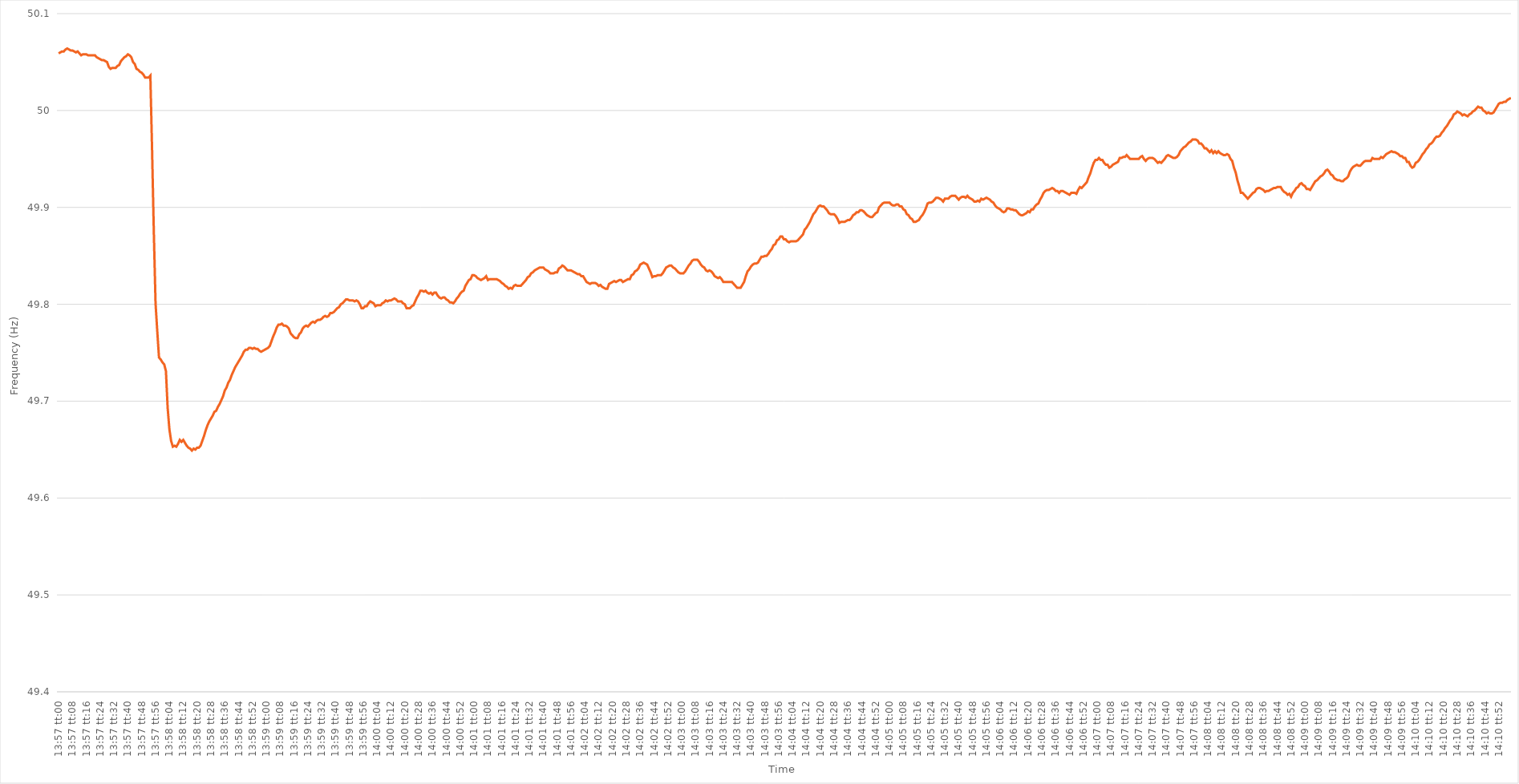
| Category | Series 0 |
|---|---|
| 0.5812499999999999 | 50.059 |
| 0.5812615740740741 | 50.06 |
| 0.5812731481481481 | 50.061 |
| 0.5812847222222223 | 50.061 |
| 0.5812962962962963 | 50.063 |
| 0.5813078703703703 | 50.064 |
| 0.5813194444444444 | 50.063 |
| 0.5813310185185185 | 50.062 |
| 0.5813425925925926 | 50.062 |
| 0.5813541666666667 | 50.061 |
| 0.5813657407407408 | 50.06 |
| 0.5813773148148148 | 50.061 |
| 0.5813888888888888 | 50.059 |
| 0.581400462962963 | 50.057 |
| 0.581412037037037 | 50.058 |
| 0.5814236111111112 | 50.058 |
| 0.5814351851851852 | 50.058 |
| 0.5814467592592593 | 50.057 |
| 0.5814583333333333 | 50.057 |
| 0.5814699074074073 | 50.057 |
| 0.5814814814814815 | 50.057 |
| 0.5814930555555555 | 50.057 |
| 0.5815046296296297 | 50.055 |
| 0.5815162037037037 | 50.054 |
| 0.5815277777777778 | 50.053 |
| 0.5815393518518518 | 50.052 |
| 0.5815509259259259 | 50.052 |
| 0.5815625 | 50.051 |
| 0.5815740740740741 | 50.05 |
| 0.5815856481481482 | 50.045 |
| 0.5815972222222222 | 50.043 |
| 0.5816087962962962 | 50.044 |
| 0.5816203703703704 | 50.044 |
| 0.5816319444444444 | 50.044 |
| 0.5816435185185186 | 50.046 |
| 0.5816550925925926 | 50.047 |
| 0.5816666666666667 | 50.051 |
| 0.5816782407407407 | 50.053 |
| 0.5816898148148147 | 50.055 |
| 0.5817013888888889 | 50.056 |
| 0.5817129629629629 | 50.058 |
| 0.5817245370370371 | 50.057 |
| 0.5817361111111111 | 50.055 |
| 0.5817476851851852 | 50.05 |
| 0.5817592592592592 | 50.048 |
| 0.5817708333333333 | 50.043 |
| 0.5817824074074074 | 50.042 |
| 0.5817939814814815 | 50.04 |
| 0.5818055555555556 | 50.039 |
| 0.5818171296296296 | 50.037 |
| 0.5818287037037037 | 50.034 |
| 0.5818402777777778 | 50.034 |
| 0.5818518518518518 | 50.034 |
| 0.581863425925926 | 50.036 |
| 0.581875 | 49.959 |
| 0.5818865740740741 | 49.875 |
| 0.5818981481481481 | 49.801 |
| 0.5819097222222223 | 49.772 |
| 0.5819212962962963 | 49.745 |
| 0.5819328703703703 | 49.743 |
| 0.5819444444444445 | 49.74 |
| 0.5819560185185185 | 49.738 |
| 0.5819675925925926 | 49.731 |
| 0.5819791666666666 | 49.693 |
| 0.5819907407407408 | 49.671 |
| 0.5820023148148148 | 49.659 |
| 0.5820138888888889 | 49.653 |
| 0.582025462962963 | 49.654 |
| 0.582037037037037 | 49.653 |
| 0.5820486111111111 | 49.656 |
| 0.5820601851851852 | 49.66 |
| 0.5820717592592592 | 49.658 |
| 0.5820833333333334 | 49.66 |
| 0.5820949074074074 | 49.657 |
| 0.5821064814814815 | 49.654 |
| 0.5821180555555555 | 49.652 |
| 0.5821296296296297 | 49.651 |
| 0.5821412037037037 | 49.649 |
| 0.5821527777777777 | 49.651 |
| 0.5821643518518519 | 49.65 |
| 0.5821759259259259 | 49.652 |
| 0.5821875 | 49.652 |
| 0.582199074074074 | 49.654 |
| 0.5822106481481482 | 49.659 |
| 0.5822222222222222 | 49.664 |
| 0.5822337962962963 | 49.67 |
| 0.5822453703703704 | 49.675 |
| 0.5822569444444444 | 49.679 |
| 0.5822685185185185 | 49.682 |
| 0.5822800925925926 | 49.685 |
| 0.5822916666666667 | 49.689 |
| 0.5823032407407408 | 49.69 |
| 0.5823148148148148 | 49.694 |
| 0.5823263888888889 | 49.697 |
| 0.5823379629629629 | 49.701 |
| 0.5823495370370371 | 49.705 |
| 0.5823611111111111 | 49.711 |
| 0.5823726851851853 | 49.714 |
| 0.5823842592592593 | 49.719 |
| 0.5823958333333333 | 49.722 |
| 0.5824074074074074 | 49.727 |
| 0.5824189814814814 | 49.731 |
| 0.5824305555555556 | 49.735 |
| 0.5824421296296296 | 49.738 |
| 0.5824537037037038 | 49.741 |
| 0.5824652777777778 | 49.744 |
| 0.5824768518518518 | 49.747 |
| 0.5824884259259259 | 49.751 |
| 0.5825 | 49.753 |
| 0.5825115740740741 | 49.753 |
| 0.5825231481481482 | 49.755 |
| 0.5825347222222222 | 49.755 |
| 0.5825462962962963 | 49.754 |
| 0.5825578703703703 | 49.755 |
| 0.5825694444444445 | 49.754 |
| 0.5825810185185185 | 49.754 |
| 0.5825925925925927 | 49.752 |
| 0.5826041666666667 | 49.751 |
| 0.5826157407407407 | 49.752 |
| 0.5826273148148148 | 49.753 |
| 0.5826388888888888 | 49.754 |
| 0.582650462962963 | 49.755 |
| 0.582662037037037 | 49.757 |
| 0.5826736111111112 | 49.762 |
| 0.5826851851851852 | 49.767 |
| 0.5826967592592592 | 49.771 |
| 0.5827083333333333 | 49.776 |
| 0.5827199074074074 | 49.779 |
| 0.5827314814814815 | 49.779 |
| 0.5827430555555556 | 49.78 |
| 0.5827546296296297 | 49.778 |
| 0.5827662037037037 | 49.778 |
| 0.5827777777777777 | 49.777 |
| 0.5827893518518519 | 49.775 |
| 0.5828009259259259 | 49.77 |
| 0.5828125000000001 | 49.768 |
| 0.5828240740740741 | 49.766 |
| 0.5828356481481481 | 49.765 |
| 0.5828472222222222 | 49.765 |
| 0.5828587962962963 | 49.769 |
| 0.5828703703703704 | 49.771 |
| 0.5828819444444444 | 49.775 |
| 0.5828935185185186 | 49.777 |
| 0.5829050925925926 | 49.778 |
| 0.5829166666666666 | 49.777 |
| 0.5829282407407407 | 49.779 |
| 0.5829398148148148 | 49.781 |
| 0.5829513888888889 | 49.782 |
| 0.582962962962963 | 49.781 |
| 0.582974537037037 | 49.783 |
| 0.5829861111111111 | 49.784 |
| 0.5829976851851851 | 49.784 |
| 0.5830092592592593 | 49.785 |
| 0.5830208333333333 | 49.787 |
| 0.5830324074074075 | 49.788 |
| 0.5830439814814815 | 49.787 |
| 0.5830555555555555 | 49.788 |
| 0.5830671296296296 | 49.791 |
| 0.5830787037037037 | 49.791 |
| 0.5830902777777778 | 49.792 |
| 0.5831018518518518 | 49.794 |
| 0.583113425925926 | 49.796 |
| 0.583125 | 49.797 |
| 0.583136574074074 | 49.8 |
| 0.5831481481481481 | 49.801 |
| 0.5831597222222222 | 49.803 |
| 0.5831712962962963 | 49.805 |
| 0.5831828703703704 | 49.805 |
| 0.5831944444444445 | 49.804 |
| 0.5832060185185185 | 49.804 |
| 0.5832175925925925 | 49.804 |
| 0.5832291666666667 | 49.803 |
| 0.5832407407407407 | 49.804 |
| 0.5832523148148149 | 49.803 |
| 0.5832638888888889 | 49.8 |
| 0.583275462962963 | 49.796 |
| 0.583287037037037 | 49.796 |
| 0.5832986111111111 | 49.798 |
| 0.5833101851851852 | 49.798 |
| 0.5833217592592593 | 49.801 |
| 0.5833333333333334 | 49.803 |
| 0.5833449074074074 | 49.802 |
| 0.5833564814814814 | 49.801 |
| 0.5833680555555555 | 49.798 |
| 0.5833796296296296 | 49.799 |
| 0.5833912037037037 | 49.799 |
| 0.5834027777777778 | 49.799 |
| 0.5834143518518519 | 49.801 |
| 0.5834259259259259 | 49.802 |
| 0.5834374999999999 | 49.804 |
| 0.5834490740740741 | 49.803 |
| 0.5834606481481481 | 49.804 |
| 0.5834722222222223 | 49.804 |
| 0.5834837962962963 | 49.805 |
| 0.5834953703703704 | 49.806 |
| 0.5835069444444444 | 49.805 |
| 0.5835185185185185 | 49.803 |
| 0.5835300925925926 | 49.803 |
| 0.5835416666666667 | 49.803 |
| 0.5835532407407408 | 49.801 |
| 0.5835648148148148 | 49.8 |
| 0.5835763888888889 | 49.796 |
| 0.5835879629629629 | 49.796 |
| 0.583599537037037 | 49.796 |
| 0.5836111111111111 | 49.798 |
| 0.5836226851851852 | 49.799 |
| 0.5836342592592593 | 49.803 |
| 0.5836458333333333 | 49.807 |
| 0.5836574074074073 | 49.81 |
| 0.5836689814814815 | 49.814 |
| 0.5836805555555555 | 49.814 |
| 0.5836921296296297 | 49.813 |
| 0.5837037037037037 | 49.814 |
| 0.5837152777777778 | 49.812 |
| 0.5837268518518518 | 49.811 |
| 0.583738425925926 | 49.812 |
| 0.58375 | 49.81 |
| 0.5837615740740741 | 49.812 |
| 0.5837731481481482 | 49.812 |
| 0.5837847222222222 | 49.809 |
| 0.5837962962962963 | 49.807 |
| 0.5838078703703703 | 49.806 |
| 0.5838194444444444 | 49.807 |
| 0.5838310185185185 | 49.807 |
| 0.5838425925925926 | 49.805 |
| 0.5838541666666667 | 49.804 |
| 0.5838657407407407 | 49.802 |
| 0.5838773148148148 | 49.802 |
| 0.5838888888888889 | 49.801 |
| 0.5839004629629629 | 49.803 |
| 0.5839120370370371 | 49.806 |
| 0.5839236111111111 | 49.808 |
| 0.5839351851851852 | 49.811 |
| 0.5839467592592592 | 49.813 |
| 0.5839583333333334 | 49.814 |
| 0.5839699074074074 | 49.819 |
| 0.5839814814814815 | 49.822 |
| 0.5839930555555556 | 49.825 |
| 0.5840046296296296 | 49.826 |
| 0.5840162037037037 | 49.83 |
| 0.5840277777777778 | 49.83 |
| 0.5840393518518519 | 49.829 |
| 0.5840509259259259 | 49.827 |
| 0.5840625 | 49.826 |
| 0.5840740740740741 | 49.825 |
| 0.5840856481481481 | 49.826 |
| 0.5840972222222222 | 49.827 |
| 0.5841087962962963 | 49.829 |
| 0.5841203703703703 | 49.825 |
| 0.5841319444444445 | 49.826 |
| 0.5841435185185185 | 49.826 |
| 0.5841550925925926 | 49.826 |
| 0.5841666666666666 | 49.826 |
| 0.5841782407407408 | 49.826 |
| 0.5841898148148148 | 49.825 |
| 0.584201388888889 | 49.824 |
| 0.584212962962963 | 49.822 |
| 0.584224537037037 | 49.821 |
| 0.5842361111111111 | 49.819 |
| 0.5842476851851852 | 49.818 |
| 0.5842592592592593 | 49.816 |
| 0.5842708333333334 | 49.817 |
| 0.5842824074074074 | 49.816 |
| 0.5842939814814815 | 49.819 |
| 0.5843055555555555 | 49.82 |
| 0.5843171296296296 | 49.819 |
| 0.5843287037037037 | 49.819 |
| 0.5843402777777778 | 49.819 |
| 0.5843518518518519 | 49.821 |
| 0.5843634259259259 | 49.823 |
| 0.584375 | 49.825 |
| 0.584386574074074 | 49.828 |
| 0.5843981481481482 | 49.829 |
| 0.5844097222222222 | 49.832 |
| 0.5844212962962964 | 49.833 |
| 0.5844328703703704 | 49.835 |
| 0.5844444444444444 | 49.836 |
| 0.5844560185185185 | 49.837 |
| 0.5844675925925926 | 49.838 |
| 0.5844791666666667 | 49.838 |
| 0.5844907407407408 | 49.838 |
| 0.5845023148148148 | 49.836 |
| 0.5845138888888889 | 49.835 |
| 0.5845254629629629 | 49.834 |
| 0.584537037037037 | 49.832 |
| 0.5845486111111111 | 49.832 |
| 0.5845601851851852 | 49.832 |
| 0.5845717592592593 | 49.833 |
| 0.5845833333333333 | 49.833 |
| 0.5845949074074074 | 49.837 |
| 0.5846064814814814 | 49.838 |
| 0.5846180555555556 | 49.84 |
| 0.5846296296296296 | 49.839 |
| 0.5846412037037038 | 49.837 |
| 0.5846527777777778 | 49.835 |
| 0.5846643518518518 | 49.835 |
| 0.5846759259259259 | 49.835 |
| 0.5846875 | 49.834 |
| 0.5846990740740741 | 49.833 |
| 0.5847106481481482 | 49.832 |
| 0.5847222222222223 | 49.831 |
| 0.5847337962962963 | 49.831 |
| 0.5847453703703703 | 49.829 |
| 0.5847569444444444 | 49.829 |
| 0.5847685185185185 | 49.826 |
| 0.5847800925925926 | 49.823 |
| 0.5847916666666667 | 49.822 |
| 0.5848032407407407 | 49.821 |
| 0.5848148148148148 | 49.822 |
| 0.5848263888888888 | 49.822 |
| 0.584837962962963 | 49.822 |
| 0.584849537037037 | 49.821 |
| 0.5848611111111112 | 49.819 |
| 0.5848726851851852 | 49.82 |
| 0.5848842592592592 | 49.818 |
| 0.5848958333333333 | 49.817 |
| 0.5849074074074074 | 49.816 |
| 0.5849189814814815 | 49.816 |
| 0.5849305555555556 | 49.821 |
| 0.5849421296296297 | 49.822 |
| 0.5849537037037037 | 49.823 |
| 0.5849652777777777 | 49.824 |
| 0.5849768518518519 | 49.823 |
| 0.5849884259259259 | 49.824 |
| 0.585 | 49.825 |
| 0.5850115740740741 | 49.825 |
| 0.5850231481481482 | 49.823 |
| 0.5850347222222222 | 49.824 |
| 0.5850462962962962 | 49.825 |
| 0.5850578703703704 | 49.826 |
| 0.5850694444444444 | 49.826 |
| 0.5850810185185186 | 49.83 |
| 0.5850925925925926 | 49.831 |
| 0.5851041666666666 | 49.834 |
| 0.5851157407407407 | 49.835 |
| 0.5851273148148148 | 49.837 |
| 0.5851388888888889 | 49.841 |
| 0.585150462962963 | 49.842 |
| 0.5851620370370371 | 49.843 |
| 0.5851736111111111 | 49.842 |
| 0.5851851851851851 | 49.841 |
| 0.5851967592592593 | 49.837 |
| 0.5852083333333333 | 49.833 |
| 0.5852199074074075 | 49.828 |
| 0.5852314814814815 | 49.829 |
| 0.5852430555555556 | 49.829 |
| 0.5852546296296296 | 49.83 |
| 0.5852662037037036 | 49.83 |
| 0.5852777777777778 | 49.83 |
| 0.5852893518518518 | 49.832 |
| 0.585300925925926 | 49.835 |
| 0.5853125 | 49.838 |
| 0.585324074074074 | 49.839 |
| 0.5853356481481481 | 49.84 |
| 0.5853472222222222 | 49.84 |
| 0.5853587962962963 | 49.838 |
| 0.5853703703703704 | 49.837 |
| 0.5853819444444445 | 49.835 |
| 0.5853935185185185 | 49.833 |
| 0.5854050925925925 | 49.832 |
| 0.5854166666666667 | 49.832 |
| 0.5854282407407407 | 49.832 |
| 0.5854398148148149 | 49.834 |
| 0.5854513888888889 | 49.837 |
| 0.585462962962963 | 49.84 |
| 0.585474537037037 | 49.842 |
| 0.585486111111111 | 49.845 |
| 0.5854976851851852 | 49.846 |
| 0.5855092592592592 | 49.846 |
| 0.5855208333333334 | 49.846 |
| 0.5855324074074074 | 49.844 |
| 0.5855439814814815 | 49.841 |
| 0.5855555555555555 | 49.839 |
| 0.5855671296296296 | 49.838 |
| 0.5855787037037037 | 49.835 |
| 0.5855902777777778 | 49.834 |
| 0.5856018518518519 | 49.835 |
| 0.5856134259259259 | 49.834 |
| 0.585625 | 49.832 |
| 0.5856365740740741 | 49.829 |
| 0.5856481481481481 | 49.828 |
| 0.5856597222222223 | 49.827 |
| 0.5856712962962963 | 49.828 |
| 0.5856828703703704 | 49.826 |
| 0.5856944444444444 | 49.823 |
| 0.5857060185185184 | 49.823 |
| 0.5857175925925926 | 49.823 |
| 0.5857291666666666 | 49.823 |
| 0.5857407407407408 | 49.823 |
| 0.5857523148148148 | 49.823 |
| 0.5857638888888889 | 49.821 |
| 0.5857754629629629 | 49.819 |
| 0.585787037037037 | 49.817 |
| 0.5857986111111111 | 49.817 |
| 0.5858101851851852 | 49.817 |
| 0.5858217592592593 | 49.82 |
| 0.5858333333333333 | 49.823 |
| 0.5858449074074074 | 49.829 |
| 0.5858564814814815 | 49.834 |
| 0.5858680555555555 | 49.836 |
| 0.5858796296296297 | 49.839 |
| 0.5858912037037037 | 49.841 |
| 0.5859027777777778 | 49.842 |
| 0.5859143518518518 | 49.842 |
| 0.585925925925926 | 49.843 |
| 0.5859375 | 49.846 |
| 0.585949074074074 | 49.849 |
| 0.5859606481481482 | 49.849 |
| 0.5859722222222222 | 49.85 |
| 0.5859837962962963 | 49.85 |
| 0.5859953703703703 | 49.852 |
| 0.5860069444444445 | 49.855 |
| 0.5860185185185185 | 49.857 |
| 0.5860300925925926 | 49.861 |
| 0.5860416666666667 | 49.862 |
| 0.5860532407407407 | 49.866 |
| 0.5860648148148148 | 49.867 |
| 0.5860763888888889 | 49.87 |
| 0.586087962962963 | 49.87 |
| 0.5860995370370371 | 49.867 |
| 0.5861111111111111 | 49.867 |
| 0.5861226851851852 | 49.865 |
| 0.5861342592592592 | 49.864 |
| 0.5861458333333334 | 49.865 |
| 0.5861574074074074 | 49.865 |
| 0.5861689814814816 | 49.865 |
| 0.5861805555555556 | 49.865 |
| 0.5861921296296296 | 49.866 |
| 0.5862037037037037 | 49.868 |
| 0.5862152777777777 | 49.87 |
| 0.5862268518518519 | 49.872 |
| 0.5862384259259259 | 49.877 |
| 0.58625 | 49.879 |
| 0.5862615740740741 | 49.882 |
| 0.5862731481481481 | 49.885 |
| 0.5862847222222222 | 49.889 |
| 0.5862962962962963 | 49.893 |
| 0.5863078703703704 | 49.895 |
| 0.5863194444444445 | 49.898 |
| 0.5863310185185185 | 49.901 |
| 0.5863425925925926 | 49.902 |
| 0.5863541666666666 | 49.901 |
| 0.5863657407407408 | 49.901 |
| 0.5863773148148148 | 49.899 |
| 0.586388888888889 | 49.897 |
| 0.586400462962963 | 49.894 |
| 0.586412037037037 | 49.893 |
| 0.5864236111111111 | 49.893 |
| 0.5864351851851851 | 49.893 |
| 0.5864467592592593 | 49.891 |
| 0.5864583333333333 | 49.888 |
| 0.5864699074074075 | 49.884 |
| 0.5864814814814815 | 49.885 |
| 0.5864930555555555 | 49.885 |
| 0.5865046296296296 | 49.885 |
| 0.5865162037037037 | 49.886 |
| 0.5865277777777778 | 49.887 |
| 0.5865393518518519 | 49.887 |
| 0.586550925925926 | 49.889 |
| 0.5865625 | 49.892 |
| 0.586574074074074 | 49.893 |
| 0.5865856481481482 | 49.895 |
| 0.5865972222222222 | 49.895 |
| 0.5866087962962964 | 49.897 |
| 0.5866203703703704 | 49.897 |
| 0.5866319444444444 | 49.896 |
| 0.5866435185185185 | 49.894 |
| 0.5866550925925925 | 49.892 |
| 0.5866666666666667 | 49.891 |
| 0.5866782407407407 | 49.89 |
| 0.5866898148148149 | 49.89 |
| 0.5867013888888889 | 49.892 |
| 0.5867129629629629 | 49.894 |
| 0.586724537037037 | 49.895 |
| 0.5867361111111111 | 49.9 |
| 0.5867476851851852 | 49.902 |
| 0.5867592592592593 | 49.904 |
| 0.5867708333333334 | 49.905 |
| 0.5867824074074074 | 49.905 |
| 0.5867939814814814 | 49.905 |
| 0.5868055555555556 | 49.905 |
| 0.5868171296296296 | 49.903 |
| 0.5868287037037038 | 49.902 |
| 0.5868402777777778 | 49.902 |
| 0.5868518518518518 | 49.903 |
| 0.5868634259259259 | 49.903 |
| 0.586875 | 49.901 |
| 0.5868865740740741 | 49.901 |
| 0.5868981481481481 | 49.898 |
| 0.5869097222222223 | 49.897 |
| 0.5869212962962963 | 49.893 |
| 0.5869328703703703 | 49.892 |
| 0.5869444444444444 | 49.889 |
| 0.5869560185185185 | 49.888 |
| 0.5869675925925926 | 49.885 |
| 0.5869791666666667 | 49.885 |
| 0.5869907407407408 | 49.886 |
| 0.5870023148148148 | 49.887 |
| 0.5870138888888888 | 49.89 |
| 0.587025462962963 | 49.892 |
| 0.587037037037037 | 49.895 |
| 0.5870486111111112 | 49.899 |
| 0.5870601851851852 | 49.904 |
| 0.5870717592592593 | 49.905 |
| 0.5870833333333333 | 49.905 |
| 0.5870949074074074 | 49.906 |
| 0.5871064814814815 | 49.908 |
| 0.5871180555555556 | 49.91 |
| 0.5871296296296297 | 49.91 |
| 0.5871412037037037 | 49.909 |
| 0.5871527777777777 | 49.908 |
| 0.5871643518518518 | 49.906 |
| 0.5871759259259259 | 49.909 |
| 0.5871875 | 49.909 |
| 0.5871990740740741 | 49.909 |
| 0.5872106481481482 | 49.911 |
| 0.5872222222222222 | 49.912 |
| 0.5872337962962962 | 49.912 |
| 0.5872453703703704 | 49.912 |
| 0.5872569444444444 | 49.91 |
| 0.5872685185185186 | 49.908 |
| 0.5872800925925926 | 49.91 |
| 0.5872916666666667 | 49.911 |
| 0.5873032407407407 | 49.911 |
| 0.5873148148148148 | 49.91 |
| 0.5873263888888889 | 49.912 |
| 0.587337962962963 | 49.91 |
| 0.5873495370370371 | 49.909 |
| 0.5873611111111111 | 49.908 |
| 0.5873726851851852 | 49.906 |
| 0.5873842592592592 | 49.906 |
| 0.5873958333333333 | 49.907 |
| 0.5874074074074074 | 49.906 |
| 0.5874189814814815 | 49.909 |
| 0.5874305555555556 | 49.908 |
| 0.5874421296296296 | 49.909 |
| 0.5874537037037036 | 49.91 |
| 0.5874652777777778 | 49.909 |
| 0.5874768518518518 | 49.908 |
| 0.587488425925926 | 49.906 |
| 0.5875 | 49.905 |
| 0.5875115740740741 | 49.902 |
| 0.5875231481481481 | 49.9 |
| 0.5875347222222222 | 49.899 |
| 0.5875462962962963 | 49.898 |
| 0.5875578703703704 | 49.896 |
| 0.5875694444444445 | 49.895 |
| 0.5875810185185185 | 49.896 |
| 0.5875925925925926 | 49.899 |
| 0.5876041666666666 | 49.899 |
| 0.5876157407407407 | 49.898 |
| 0.5876273148148148 | 49.898 |
| 0.5876388888888889 | 49.897 |
| 0.587650462962963 | 49.897 |
| 0.587662037037037 | 49.895 |
| 0.587673611111111 | 49.893 |
| 0.5876851851851852 | 49.892 |
| 0.5876967592592592 | 49.892 |
| 0.5877083333333334 | 49.893 |
| 0.5877199074074074 | 49.894 |
| 0.5877314814814815 | 49.896 |
| 0.5877430555555555 | 49.895 |
| 0.5877546296296297 | 49.898 |
| 0.5877662037037037 | 49.898 |
| 0.5877777777777778 | 49.901 |
| 0.5877893518518519 | 49.903 |
| 0.5878009259259259 | 49.904 |
| 0.5878125 | 49.908 |
| 0.5878240740740741 | 49.911 |
| 0.5878356481481481 | 49.915 |
| 0.5878472222222222 | 49.917 |
| 0.5878587962962963 | 49.918 |
| 0.5878703703703704 | 49.918 |
| 0.5878819444444444 | 49.919 |
| 0.5878935185185185 | 49.92 |
| 0.5879050925925926 | 49.919 |
| 0.5879166666666666 | 49.917 |
| 0.5879282407407408 | 49.917 |
| 0.5879398148148148 | 49.915 |
| 0.5879513888888889 | 49.917 |
| 0.5879629629629629 | 49.917 |
| 0.5879745370370371 | 49.916 |
| 0.5879861111111111 | 49.915 |
| 0.5879976851851852 | 49.914 |
| 0.5880092592592593 | 49.913 |
| 0.5880208333333333 | 49.915 |
| 0.5880324074074074 | 49.915 |
| 0.5880439814814815 | 49.915 |
| 0.5880555555555556 | 49.914 |
| 0.5880671296296297 | 49.918 |
| 0.5880787037037037 | 49.921 |
| 0.5880902777777778 | 49.92 |
| 0.5881018518518518 | 49.922 |
| 0.5881134259259259 | 49.924 |
| 0.588125 | 49.926 |
| 0.588136574074074 | 49.931 |
| 0.5881481481481482 | 49.935 |
| 0.5881597222222222 | 49.941 |
| 0.5881712962962963 | 49.946 |
| 0.5881828703703703 | 49.949 |
| 0.5881944444444445 | 49.949 |
| 0.5882060185185185 | 49.951 |
| 0.5882175925925927 | 49.949 |
| 0.5882291666666667 | 49.949 |
| 0.5882407407407407 | 49.946 |
| 0.5882523148148148 | 49.944 |
| 0.5882638888888889 | 49.944 |
| 0.588275462962963 | 49.941 |
| 0.5882870370370371 | 49.942 |
| 0.5882986111111111 | 49.944 |
| 0.5883101851851852 | 49.945 |
| 0.5883217592592592 | 49.946 |
| 0.5883333333333333 | 49.947 |
| 0.5883449074074074 | 49.951 |
| 0.5883564814814815 | 49.951 |
| 0.5883680555555556 | 49.952 |
| 0.5883796296296296 | 49.952 |
| 0.5883912037037037 | 49.954 |
| 0.5884027777777777 | 49.952 |
| 0.5884143518518519 | 49.95 |
| 0.5884259259259259 | 49.95 |
| 0.5884375000000001 | 49.95 |
| 0.5884490740740741 | 49.95 |
| 0.5884606481481481 | 49.95 |
| 0.5884722222222222 | 49.95 |
| 0.5884837962962963 | 49.952 |
| 0.5884953703703704 | 49.953 |
| 0.5885069444444445 | 49.95 |
| 0.5885185185185186 | 49.948 |
| 0.5885300925925926 | 49.95 |
| 0.5885416666666666 | 49.951 |
| 0.5885532407407407 | 49.951 |
| 0.5885648148148148 | 49.951 |
| 0.5885763888888889 | 49.95 |
| 0.588587962962963 | 49.948 |
| 0.588599537037037 | 49.946 |
| 0.5886111111111111 | 49.947 |
| 0.5886226851851851 | 49.946 |
| 0.5886342592592593 | 49.948 |
| 0.5886458333333333 | 49.95 |
| 0.5886574074074075 | 49.953 |
| 0.5886689814814815 | 49.954 |
| 0.5886805555555555 | 49.953 |
| 0.5886921296296296 | 49.952 |
| 0.5887037037037037 | 49.951 |
| 0.5887152777777778 | 49.951 |
| 0.5887268518518519 | 49.952 |
| 0.588738425925926 | 49.954 |
| 0.58875 | 49.958 |
| 0.588761574074074 | 49.96 |
| 0.5887731481481482 | 49.962 |
| 0.5887847222222222 | 49.963 |
| 0.5887962962962963 | 49.965 |
| 0.5888078703703704 | 49.967 |
| 0.5888194444444445 | 49.968 |
| 0.5888310185185185 | 49.97 |
| 0.5888425925925925 | 49.97 |
| 0.5888541666666667 | 49.97 |
| 0.5888657407407407 | 49.969 |
| 0.5888773148148149 | 49.966 |
| 0.5888888888888889 | 49.966 |
| 0.588900462962963 | 49.964 |
| 0.588912037037037 | 49.961 |
| 0.5889236111111111 | 49.961 |
| 0.5889351851851852 | 49.959 |
| 0.5889467592592593 | 49.957 |
| 0.5889583333333334 | 49.959 |
| 0.5889699074074074 | 49.956 |
| 0.5889814814814814 | 49.958 |
| 0.5889930555555556 | 49.956 |
| 0.5890046296296296 | 49.958 |
| 0.5890162037037037 | 49.956 |
| 0.5890277777777778 | 49.955 |
| 0.5890393518518519 | 49.954 |
| 0.5890509259259259 | 49.954 |
| 0.5890624999999999 | 49.955 |
| 0.5890740740740741 | 49.954 |
| 0.5890856481481481 | 49.95 |
| 0.5890972222222223 | 49.948 |
| 0.5891087962962963 | 49.941 |
| 0.5891203703703703 | 49.936 |
| 0.5891319444444444 | 49.928 |
| 0.5891435185185185 | 49.922 |
| 0.5891550925925926 | 49.915 |
| 0.5891666666666667 | 49.915 |
| 0.5891782407407408 | 49.913 |
| 0.5891898148148148 | 49.911 |
| 0.5892013888888888 | 49.909 |
| 0.589212962962963 | 49.911 |
| 0.589224537037037 | 49.913 |
| 0.5892361111111112 | 49.915 |
| 0.5892476851851852 | 49.916 |
| 0.5892592592592593 | 49.919 |
| 0.5892708333333333 | 49.92 |
| 0.5892824074074073 | 49.92 |
| 0.5892939814814815 | 49.919 |
| 0.5893055555555555 | 49.918 |
| 0.5893171296296297 | 49.916 |
| 0.5893287037037037 | 49.917 |
| 0.5893402777777778 | 49.917 |
| 0.5893518518518518 | 49.918 |
| 0.5893634259259259 | 49.919 |
| 0.589375 | 49.92 |
| 0.5893865740740741 | 49.92 |
| 0.5893981481481482 | 49.921 |
| 0.5894097222222222 | 49.921 |
| 0.5894212962962962 | 49.921 |
| 0.5894328703703704 | 49.918 |
| 0.5894444444444444 | 49.916 |
| 0.5894560185185186 | 49.915 |
| 0.5894675925925926 | 49.913 |
| 0.5894791666666667 | 49.914 |
| 0.5894907407407407 | 49.911 |
| 0.5895023148148147 | 49.915 |
| 0.5895138888888889 | 49.917 |
| 0.5895254629629629 | 49.92 |
| 0.5895370370370371 | 49.921 |
| 0.5895486111111111 | 49.924 |
| 0.5895601851851852 | 49.925 |
| 0.5895717592592592 | 49.923 |
| 0.5895833333333333 | 49.922 |
| 0.5895949074074074 | 49.919 |
| 0.5896064814814815 | 49.919 |
| 0.5896180555555556 | 49.918 |
| 0.5896296296296296 | 49.921 |
| 0.5896412037037037 | 49.924 |
| 0.5896527777777778 | 49.927 |
| 0.5896643518518518 | 49.928 |
| 0.589675925925926 | 49.93 |
| 0.5896875 | 49.932 |
| 0.5896990740740741 | 49.933 |
| 0.5897106481481481 | 49.935 |
| 0.5897222222222221 | 49.938 |
| 0.5897337962962963 | 49.939 |
| 0.5897453703703703 | 49.937 |
| 0.5897569444444445 | 49.934 |
| 0.5897685185185185 | 49.933 |
| 0.5897800925925926 | 49.93 |
| 0.5897916666666666 | 49.929 |
| 0.5898032407407408 | 49.928 |
| 0.5898148148148148 | 49.928 |
| 0.5898263888888889 | 49.927 |
| 0.589837962962963 | 49.927 |
| 0.589849537037037 | 49.929 |
| 0.5898611111111111 | 49.93 |
| 0.5898726851851852 | 49.932 |
| 0.5898842592592592 | 49.937 |
| 0.5898958333333334 | 49.94 |
| 0.5899074074074074 | 49.942 |
| 0.5899189814814815 | 49.943 |
| 0.5899305555555555 | 49.944 |
| 0.5899421296296297 | 49.943 |
| 0.5899537037037037 | 49.943 |
| 0.5899652777777779 | 49.945 |
| 0.5899768518518519 | 49.947 |
| 0.5899884259259259 | 49.948 |
| 0.59 | 49.948 |
| 0.590011574074074 | 49.948 |
| 0.5900231481481482 | 49.948 |
| 0.5900347222222222 | 49.951 |
| 0.5900462962962963 | 49.95 |
| 0.5900578703703704 | 49.95 |
| 0.5900694444444444 | 49.95 |
| 0.5900810185185185 | 49.95 |
| 0.5900925925925926 | 49.952 |
| 0.5901041666666667 | 49.951 |
| 0.5901157407407408 | 49.953 |
| 0.5901273148148148 | 49.955 |
| 0.5901388888888889 | 49.956 |
| 0.5901504629629629 | 49.957 |
| 0.5901620370370371 | 49.958 |
| 0.5901736111111111 | 49.957 |
| 0.5901851851851853 | 49.957 |
| 0.5901967592592593 | 49.956 |
| 0.5902083333333333 | 49.955 |
| 0.5902199074074074 | 49.953 |
| 0.5902314814814814 | 49.953 |
| 0.5902430555555556 | 49.951 |
| 0.5902546296296296 | 49.951 |
| 0.5902662037037038 | 49.947 |
| 0.5902777777777778 | 49.947 |
| 0.5902893518518518 | 49.943 |
| 0.5903009259259259 | 49.941 |
| 0.5903125 | 49.942 |
| 0.5903240740740741 | 49.946 |
| 0.5903356481481482 | 49.947 |
| 0.5903472222222222 | 49.949 |
| 0.5903587962962963 | 49.952 |
| 0.5903703703703703 | 49.955 |
| 0.5903819444444445 | 49.957 |
| 0.5903935185185185 | 49.96 |
| 0.5904050925925927 | 49.962 |
| 0.5904166666666667 | 49.965 |
| 0.5904282407407407 | 49.966 |
| 0.5904398148148148 | 49.968 |
| 0.5904513888888888 | 49.971 |
| 0.590462962962963 | 49.973 |
| 0.590474537037037 | 49.973 |
| 0.5904861111111112 | 49.974 |
| 0.5904976851851852 | 49.977 |
| 0.5905092592592592 | 49.979 |
| 0.5905208333333333 | 49.982 |
| 0.5905324074074074 | 49.984 |
| 0.5905439814814815 | 49.987 |
| 0.5905555555555556 | 49.99 |
| 0.5905671296296297 | 49.992 |
| 0.5905787037037037 | 49.996 |
| 0.5905902777777777 | 49.997 |
| 0.5906018518518519 | 49.999 |
| 0.5906134259259259 | 49.998 |
| 0.5906250000000001 | 49.997 |
| 0.5906365740740741 | 49.995 |
| 0.5906481481481481 | 49.996 |
| 0.5906597222222222 | 49.995 |
| 0.5906712962962963 | 49.994 |
| 0.5906828703703704 | 49.996 |
| 0.5906944444444444 | 49.997 |
| 0.5907060185185186 | 49.999 |
| 0.5907175925925926 | 50 |
| 0.5907291666666666 | 50.002 |
| 0.5907407407407407 | 50.004 |
| 0.5907523148148148 | 50.003 |
| 0.5907638888888889 | 50.003 |
| 0.590775462962963 | 50 |
| 0.590787037037037 | 49.999 |
| 0.5907986111111111 | 49.997 |
| 0.5908101851851851 | 49.998 |
| 0.5908217592592593 | 49.997 |
| 0.5908333333333333 | 49.997 |
| 0.5908449074074075 | 49.998 |
| 0.5908564814814815 | 50.001 |
| 0.5908680555555555 | 50.004 |
| 0.5908796296296296 | 50.007 |
| 0.5908912037037037 | 50.008 |
| 0.5909027777777778 | 50.008 |
| 0.5909143518518518 | 50.009 |
| 0.590925925925926 | 50.009 |
| 0.5909375 | 50.011 |
| 0.590949074074074 | 50.012 |
| 0.5909606481481481 | 50.013 |